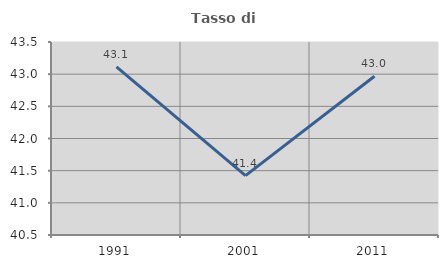
| Category | Tasso di occupazione   |
|---|---|
| 1991.0 | 43.114 |
| 2001.0 | 41.423 |
| 2011.0 | 42.968 |